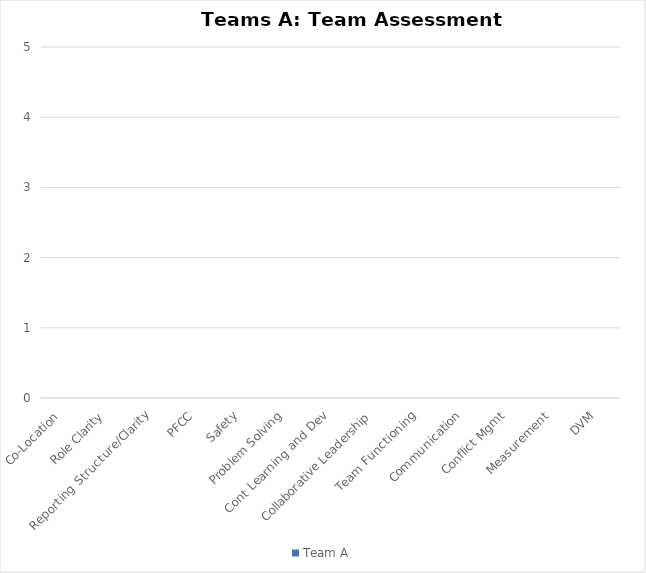
| Category | Team A |
|---|---|
| Co-Location | 0 |
| Role Clarity | 0 |
| Reporting Structure/Clarity | 0 |
| PFCC | 0 |
| Safety | 0 |
| Problem Solving | 0 |
| Cont Learning and Dev | 0 |
| Collaborative Leadership | 0 |
| Team Functioning | 0 |
| Communication | 0 |
| Conflict Mgmt | 0 |
| Measurement | 0 |
| DVM | 0 |